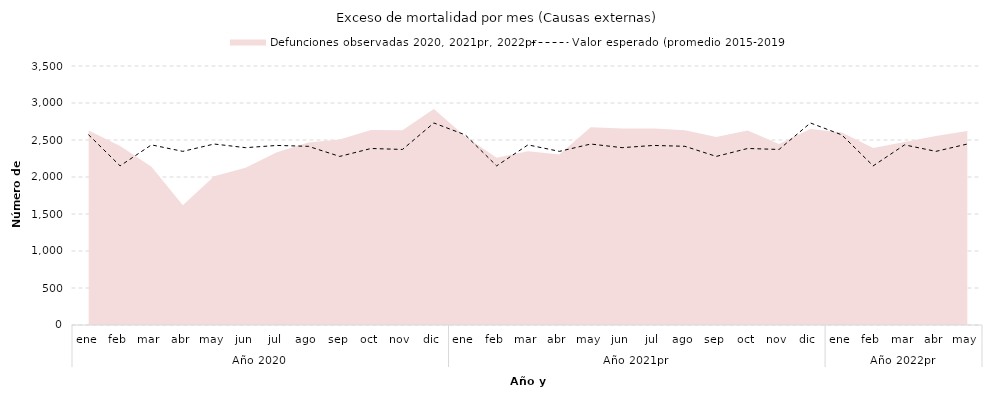
| Category | Valor esperado (promedio 2015-2019) |
|---|---|
| 0 | 2569.2 |
| 1 | 2150.4 |
| 2 | 2434.2 |
| 3 | 2346.4 |
| 4 | 2445.6 |
| 5 | 2396.4 |
| 6 | 2426.6 |
| 7 | 2414.8 |
| 8 | 2278.2 |
| 9 | 2385.4 |
| 10 | 2372.2 |
| 11 | 2730.2 |
| 12 | 2569.2 |
| 13 | 2150.4 |
| 14 | 2434.2 |
| 15 | 2346.4 |
| 16 | 2445.6 |
| 17 | 2396.4 |
| 18 | 2426.6 |
| 19 | 2414.8 |
| 20 | 2278.2 |
| 21 | 2385.4 |
| 22 | 2372.2 |
| 23 | 2730.2 |
| 24 | 2569.2 |
| 25 | 2150.4 |
| 26 | 2434.2 |
| 27 | 2346.4 |
| 28 | 2445.6 |